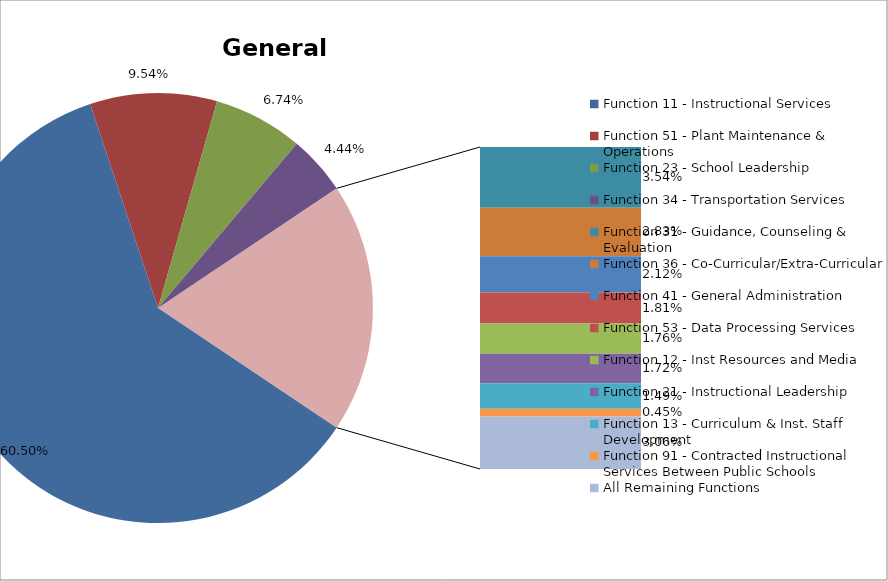
| Category | Series 0 |
|---|---|
| Function 11 - Instructional Services | 0.605 |
| Function 51 - Plant Maintenance & Operations | 0.095 |
| Function 23 - School Leadership | 0.067 |
| Function 34 - Transportation Services | 0.044 |
| Function 31 - Guidance, Counseling & Evaluation | 0.035 |
| Function 36 - Co-Curricular/Extra-Curricular | 0.028 |
| Function 41 - General Administration | 0.021 |
| Function 53 - Data Processing Services | 0.018 |
| Function 12 - Inst Resources and Media | 0.018 |
| Function 21 - Instructional Leadership | 0.017 |
| Function 13 - Curriculum & Inst. Staff Development | 0.015 |
| Function 91 - Contracted Instructional Services Between Public Schools | 0.005 |
| All Remaining Functions | 0.031 |